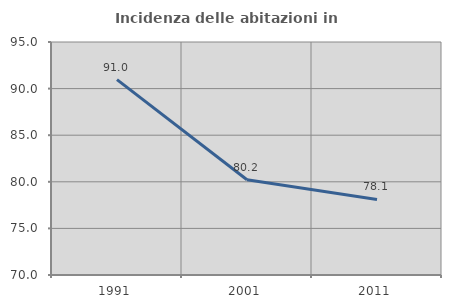
| Category | Incidenza delle abitazioni in proprietà  |
|---|---|
| 1991.0 | 90.958 |
| 2001.0 | 80.215 |
| 2011.0 | 78.112 |